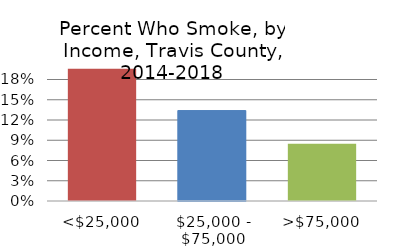
| Category | Series 0 |
|---|---|
| <$25,000 | 0.196 |
| $25,000 - $75,000 | 0.134 |
| >$75,000 | 0.085 |